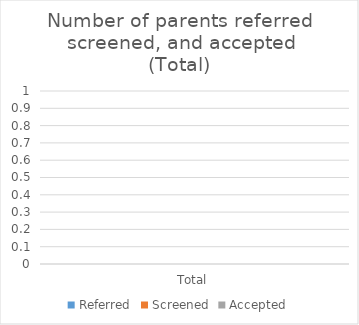
| Category | Referred | Screened | Accepted |
|---|---|---|---|
| Total | 0 | 0 | 0 |